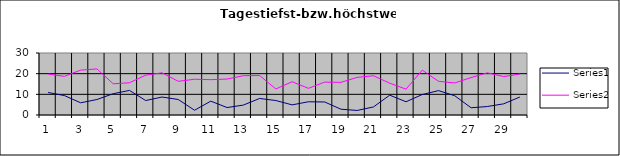
| Category | Series 0 | Series 1 |
|---|---|---|
| 0 | 10.9 | 19.8 |
| 1 | 9.4 | 18.7 |
| 2 | 5.9 | 21.7 |
| 3 | 7.5 | 22.3 |
| 4 | 10.3 | 15.1 |
| 5 | 11.9 | 15.6 |
| 6 | 7 | 19.3 |
| 7 | 8.7 | 20.4 |
| 8 | 7.5 | 16.3 |
| 9 | 2.3 | 17.3 |
| 10 | 6.7 | 17.1 |
| 11 | 3.6 | 17.4 |
| 12 | 4.8 | 19 |
| 13 | 8 | 19.1 |
| 14 | 7 | 12.6 |
| 15 | 4.9 | 16.1 |
| 16 | 6.4 | 12.9 |
| 17 | 6.3 | 15.9 |
| 18 | 2.8 | 15.8 |
| 19 | 2.2 | 18.2 |
| 20 | 3.9 | 19 |
| 21 | 9.6 | 15.4 |
| 22 | 6.4 | 12.5 |
| 23 | 9.9 | 21.7 |
| 24 | 11.8 | 16.3 |
| 25 | 9.3 | 15.5 |
| 26 | 3.5 | 18.1 |
| 27 | 4.1 | 20.4 |
| 28 | 5.4 | 18.6 |
| 29 | 8.7 | 19.8 |